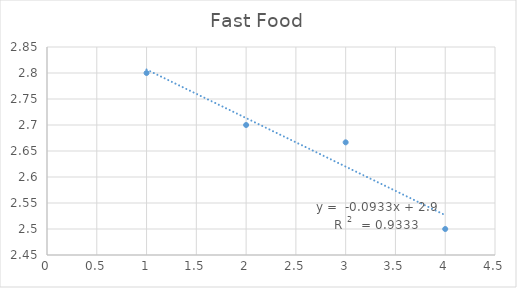
| Category | Series 0 |
|---|---|
| 1.0 | 2.8 |
| 2.0 | 2.7 |
| 3.0 | 2.667 |
| 4.0 | 2.5 |